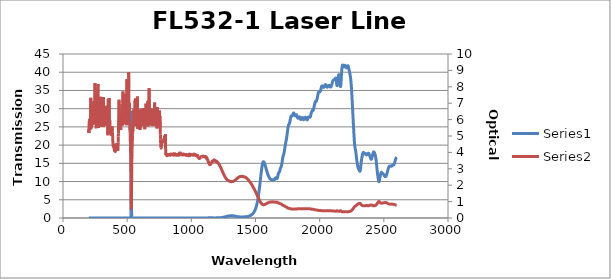
| Category | Series 0 |
|---|---|
| 2600.0 | 16.703 |
| 2599.0 | 16.659 |
| 2598.0 | 16.609 |
| 2597.0 | 16.558 |
| 2596.0 | 16.503 |
| 2595.0 | 16.426 |
| 2594.0 | 16.337 |
| 2593.0 | 16.239 |
| 2592.0 | 16.135 |
| 2591.0 | 16.023 |
| 2590.0 | 15.91 |
| 2589.0 | 15.807 |
| 2588.0 | 15.684 |
| 2587.0 | 15.555 |
| 2586.0 | 15.434 |
| 2585.0 | 15.313 |
| 2584.0 | 15.189 |
| 2583.0 | 15.06 |
| 2582.0 | 14.946 |
| 2581.0 | 14.845 |
| 2580.0 | 14.757 |
| 2579.0 | 14.694 |
| 2578.0 | 14.64 |
| 2577.0 | 14.598 |
| 2576.0 | 14.578 |
| 2575.0 | 14.567 |
| 2574.0 | 14.557 |
| 2573.0 | 14.546 |
| 2572.0 | 14.538 |
| 2571.0 | 14.523 |
| 2570.0 | 14.503 |
| 2569.0 | 14.484 |
| 2568.0 | 14.46 |
| 2567.0 | 14.419 |
| 2566.0 | 14.386 |
| 2565.0 | 14.357 |
| 2564.0 | 14.309 |
| 2563.0 | 14.27 |
| 2562.0 | 14.249 |
| 2561.0 | 14.229 |
| 2560.0 | 14.21 |
| 2559.0 | 14.217 |
| 2558.0 | 14.215 |
| 2557.0 | 14.216 |
| 2556.0 | 14.228 |
| 2555.0 | 14.237 |
| 2554.0 | 14.256 |
| 2553.0 | 14.273 |
| 2552.0 | 14.277 |
| 2551.0 | 14.286 |
| 2550.0 | 14.296 |
| 2549.0 | 14.29 |
| 2548.0 | 14.293 |
| 2547.0 | 14.28 |
| 2546.0 | 14.248 |
| 2545.0 | 14.234 |
| 2544.0 | 14.212 |
| 2543.0 | 14.166 |
| 2542.0 | 14.129 |
| 2541.0 | 14.08 |
| 2540.0 | 14.016 |
| 2539.0 | 13.948 |
| 2538.0 | 13.865 |
| 2537.0 | 13.785 |
| 2536.0 | 13.694 |
| 2535.0 | 13.585 |
| 2534.0 | 13.471 |
| 2533.0 | 13.359 |
| 2532.0 | 13.236 |
| 2531.0 | 13.104 |
| 2530.0 | 12.983 |
| 2529.0 | 12.852 |
| 2528.0 | 12.706 |
| 2527.0 | 12.574 |
| 2526.0 | 12.448 |
| 2525.0 | 12.31 |
| 2524.0 | 12.171 |
| 2523.0 | 12.061 |
| 2522.0 | 11.941 |
| 2521.0 | 11.819 |
| 2520.0 | 11.728 |
| 2519.0 | 11.645 |
| 2518.0 | 11.556 |
| 2517.0 | 11.487 |
| 2516.0 | 11.439 |
| 2515.0 | 11.384 |
| 2514.0 | 11.347 |
| 2513.0 | 11.341 |
| 2512.0 | 11.335 |
| 2511.0 | 11.33 |
| 2510.0 | 11.352 |
| 2509.0 | 11.381 |
| 2508.0 | 11.4 |
| 2507.0 | 11.439 |
| 2506.0 | 11.497 |
| 2505.0 | 11.538 |
| 2504.0 | 11.586 |
| 2503.0 | 11.655 |
| 2502.0 | 11.72 |
| 2501.0 | 11.771 |
| 2500.0 | 11.835 |
| 2499.0 | 11.902 |
| 2498.0 | 11.946 |
| 2497.0 | 11.999 |
| 2496.0 | 12.067 |
| 2495.0 | 12.101 |
| 2494.0 | 12.133 |
| 2493.0 | 12.181 |
| 2492.0 | 12.208 |
| 2491.0 | 12.221 |
| 2490.0 | 12.261 |
| 2489.0 | 12.297 |
| 2488.0 | 12.318 |
| 2487.0 | 12.365 |
| 2486.0 | 12.417 |
| 2485.0 | 12.449 |
| 2484.0 | 12.485 |
| 2483.0 | 12.527 |
| 2482.0 | 12.542 |
| 2481.0 | 12.528 |
| 2480.0 | 12.512 |
| 2479.0 | 12.475 |
| 2478.0 | 12.383 |
| 2477.0 | 12.294 |
| 2476.0 | 12.189 |
| 2475.0 | 12.036 |
| 2474.0 | 11.893 |
| 2473.0 | 11.746 |
| 2472.0 | 11.549 |
| 2471.0 | 11.362 |
| 2470.0 | 11.172 |
| 2469.0 | 10.953 |
| 2468.0 | 10.75 |
| 2467.0 | 10.559 |
| 2466.0 | 10.369 |
| 2465.0 | 10.203 |
| 2464.0 | 10.073 |
| 2463.0 | 9.997 |
| 2462.0 | 9.96 |
| 2461.0 | 9.979 |
| 2460.0 | 10.082 |
| 2459.0 | 10.206 |
| 2458.0 | 10.375 |
| 2457.0 | 10.613 |
| 2456.0 | 10.835 |
| 2455.0 | 11.078 |
| 2454.0 | 11.351 |
| 2453.0 | 11.6 |
| 2452.0 | 11.865 |
| 2451.0 | 12.159 |
| 2450.0 | 12.442 |
| 2449.0 | 12.749 |
| 2448.0 | 13.061 |
| 2447.0 | 13.39 |
| 2446.0 | 13.746 |
| 2445.0 | 14.077 |
| 2444.0 | 14.465 |
| 2443.0 | 14.827 |
| 2442.0 | 15.133 |
| 2441.0 | 15.502 |
| 2440.0 | 15.786 |
| 2439.0 | 16.044 |
| 2438.0 | 16.34 |
| 2437.0 | 16.54 |
| 2436.0 | 16.74 |
| 2435.0 | 16.947 |
| 2434.0 | 17.074 |
| 2433.0 | 17.241 |
| 2432.0 | 17.379 |
| 2431.0 | 17.482 |
| 2430.0 | 17.627 |
| 2429.0 | 17.707 |
| 2428.0 | 17.815 |
| 2427.0 | 17.914 |
| 2426.0 | 17.959 |
| 2425.0 | 18.056 |
| 2424.0 | 18.088 |
| 2423.0 | 18.099 |
| 2422.0 | 18.152 |
| 2421.0 | 18.102 |
| 2420.0 | 18.081 |
| 2419.0 | 18.069 |
| 2418.0 | 17.953 |
| 2417.0 | 17.914 |
| 2416.0 | 17.822 |
| 2415.0 | 17.68 |
| 2414.0 | 17.601 |
| 2413.0 | 17.445 |
| 2412.0 | 17.3 |
| 2411.0 | 17.164 |
| 2410.0 | 16.974 |
| 2409.0 | 16.851 |
| 2408.0 | 16.679 |
| 2407.0 | 16.525 |
| 2406.0 | 16.422 |
| 2405.0 | 16.266 |
| 2404.0 | 16.21 |
| 2403.0 | 16.151 |
| 2402.0 | 16.094 |
| 2401.0 | 16.142 |
| 2400.0 | 16.141 |
| 2399.0 | 16.196 |
| 2398.0 | 16.298 |
| 2397.0 | 16.345 |
| 2396.0 | 16.469 |
| 2395.0 | 16.569 |
| 2394.0 | 16.653 |
| 2393.0 | 16.786 |
| 2392.0 | 16.864 |
| 2391.0 | 16.989 |
| 2390.0 | 17.084 |
| 2389.0 | 17.165 |
| 2388.0 | 17.291 |
| 2387.0 | 17.353 |
| 2386.0 | 17.458 |
| 2385.0 | 17.545 |
| 2384.0 | 17.582 |
| 2383.0 | 17.681 |
| 2382.0 | 17.706 |
| 2381.0 | 17.732 |
| 2380.0 | 17.784 |
| 2379.0 | 17.754 |
| 2378.0 | 17.769 |
| 2377.0 | 17.743 |
| 2376.0 | 17.701 |
| 2375.0 | 17.682 |
| 2374.0 | 17.62 |
| 2373.0 | 17.596 |
| 2372.0 | 17.544 |
| 2371.0 | 17.494 |
| 2370.0 | 17.479 |
| 2369.0 | 17.412 |
| 2368.0 | 17.391 |
| 2367.0 | 17.356 |
| 2366.0 | 17.311 |
| 2365.0 | 17.326 |
| 2364.0 | 17.31 |
| 2363.0 | 17.346 |
| 2362.0 | 17.408 |
| 2361.0 | 17.439 |
| 2360.0 | 17.532 |
| 2359.0 | 17.576 |
| 2358.0 | 17.63 |
| 2357.0 | 17.668 |
| 2356.0 | 17.671 |
| 2355.0 | 17.688 |
| 2354.0 | 17.651 |
| 2353.0 | 17.643 |
| 2352.0 | 17.633 |
| 2351.0 | 17.61 |
| 2350.0 | 17.651 |
| 2349.0 | 17.655 |
| 2348.0 | 17.703 |
| 2347.0 | 17.766 |
| 2346.0 | 17.794 |
| 2345.0 | 17.875 |
| 2344.0 | 17.904 |
| 2343.0 | 17.945 |
| 2342.0 | 17.979 |
| 2341.0 | 17.979 |
| 2340.0 | 17.991 |
| 2339.0 | 17.942 |
| 2338.0 | 17.909 |
| 2337.0 | 17.839 |
| 2336.0 | 17.722 |
| 2335.0 | 17.635 |
| 2334.0 | 17.458 |
| 2333.0 | 17.319 |
| 2332.0 | 17.15 |
| 2331.0 | 16.946 |
| 2330.0 | 16.786 |
| 2329.0 | 16.564 |
| 2328.0 | 16.376 |
| 2327.0 | 16.146 |
| 2326.0 | 15.916 |
| 2325.0 | 15.678 |
| 2324.0 | 15.38 |
| 2323.0 | 15.096 |
| 2322.0 | 14.749 |
| 2321.0 | 14.395 |
| 2320.0 | 14.06 |
| 2319.0 | 13.705 |
| 2318.0 | 13.434 |
| 2317.0 | 13.179 |
| 2316.0 | 12.997 |
| 2315.0 | 12.895 |
| 2314.0 | 12.824 |
| 2313.0 | 12.841 |
| 2312.0 | 12.866 |
| 2311.0 | 12.94 |
| 2310.0 | 13.021 |
| 2309.0 | 13.103 |
| 2308.0 | 13.2 |
| 2307.0 | 13.252 |
| 2306.0 | 13.326 |
| 2305.0 | 13.367 |
| 2304.0 | 13.409 |
| 2303.0 | 13.47 |
| 2302.0 | 13.524 |
| 2301.0 | 13.61 |
| 2300.0 | 13.709 |
| 2299.0 | 13.834 |
| 2298.0 | 13.982 |
| 2297.0 | 14.149 |
| 2296.0 | 14.336 |
| 2295.0 | 14.542 |
| 2294.0 | 14.759 |
| 2293.0 | 14.97 |
| 2292.0 | 15.207 |
| 2291.0 | 15.451 |
| 2290.0 | 15.697 |
| 2289.0 | 15.969 |
| 2288.0 | 16.243 |
| 2287.0 | 16.522 |
| 2286.0 | 16.809 |
| 2285.0 | 17.103 |
| 2284.0 | 17.391 |
| 2283.0 | 17.684 |
| 2282.0 | 17.971 |
| 2281.0 | 18.213 |
| 2280.0 | 18.452 |
| 2279.0 | 18.664 |
| 2278.0 | 18.857 |
| 2277.0 | 19.052 |
| 2276.0 | 19.245 |
| 2275.0 | 19.478 |
| 2274.0 | 19.71 |
| 2273.0 | 20.017 |
| 2272.0 | 20.368 |
| 2271.0 | 20.783 |
| 2270.0 | 21.283 |
| 2269.0 | 21.816 |
| 2268.0 | 22.4 |
| 2267.0 | 23.004 |
| 2266.0 | 23.636 |
| 2265.0 | 24.272 |
| 2264.0 | 24.935 |
| 2263.0 | 25.626 |
| 2262.0 | 26.289 |
| 2261.0 | 26.964 |
| 2260.0 | 27.614 |
| 2259.0 | 28.306 |
| 2258.0 | 28.966 |
| 2257.0 | 29.659 |
| 2256.0 | 30.353 |
| 2255.0 | 31.009 |
| 2254.0 | 31.699 |
| 2253.0 | 32.351 |
| 2252.0 | 33.007 |
| 2251.0 | 33.647 |
| 2250.0 | 34.283 |
| 2249.0 | 34.872 |
| 2248.0 | 35.417 |
| 2247.0 | 35.954 |
| 2246.0 | 36.438 |
| 2245.0 | 36.894 |
| 2244.0 | 37.326 |
| 2243.0 | 37.706 |
| 2242.0 | 38.052 |
| 2241.0 | 38.361 |
| 2240.0 | 38.641 |
| 2239.0 | 38.882 |
| 2238.0 | 39.111 |
| 2237.0 | 39.31 |
| 2236.0 | 39.484 |
| 2235.0 | 39.649 |
| 2234.0 | 39.81 |
| 2233.0 | 39.966 |
| 2232.0 | 40.129 |
| 2231.0 | 40.308 |
| 2230.0 | 40.485 |
| 2229.0 | 40.665 |
| 2228.0 | 40.86 |
| 2227.0 | 41.038 |
| 2226.0 | 41.213 |
| 2225.0 | 41.377 |
| 2224.0 | 41.509 |
| 2223.0 | 41.624 |
| 2222.0 | 41.708 |
| 2221.0 | 41.754 |
| 2220.0 | 41.78 |
| 2219.0 | 41.765 |
| 2218.0 | 41.725 |
| 2217.0 | 41.669 |
| 2216.0 | 41.584 |
| 2215.0 | 41.504 |
| 2214.0 | 41.414 |
| 2213.0 | 41.327 |
| 2212.0 | 41.266 |
| 2211.0 | 41.208 |
| 2210.0 | 41.182 |
| 2209.0 | 41.189 |
| 2208.0 | 41.203 |
| 2207.0 | 41.251 |
| 2206.0 | 41.313 |
| 2205.0 | 41.393 |
| 2204.0 | 41.484 |
| 2203.0 | 41.573 |
| 2202.0 | 41.67 |
| 2201.0 | 41.752 |
| 2200.0 | 41.827 |
| 2199.0 | 41.883 |
| 2198.0 | 41.909 |
| 2197.0 | 41.911 |
| 2196.0 | 41.894 |
| 2195.0 | 41.847 |
| 2194.0 | 41.79 |
| 2193.0 | 41.706 |
| 2192.0 | 41.626 |
| 2191.0 | 41.564 |
| 2190.0 | 41.492 |
| 2189.0 | 41.473 |
| 2188.0 | 41.466 |
| 2187.0 | 41.493 |
| 2186.0 | 41.565 |
| 2185.0 | 41.638 |
| 2184.0 | 41.731 |
| 2183.0 | 41.822 |
| 2182.0 | 41.89 |
| 2181.0 | 41.958 |
| 2180.0 | 41.981 |
| 2179.0 | 41.985 |
| 2178.0 | 41.948 |
| 2177.0 | 41.855 |
| 2176.0 | 41.72 |
| 2175.0 | 41.521 |
| 2174.0 | 41.249 |
| 2173.0 | 40.905 |
| 2172.0 | 40.471 |
| 2171.0 | 39.975 |
| 2170.0 | 39.403 |
| 2169.0 | 38.767 |
| 2168.0 | 38.153 |
| 2167.0 | 37.52 |
| 2166.0 | 36.971 |
| 2165.0 | 36.553 |
| 2164.0 | 36.239 |
| 2163.0 | 36.096 |
| 2162.0 | 36.079 |
| 2161.0 | 36.211 |
| 2160.0 | 36.451 |
| 2159.0 | 36.764 |
| 2158.0 | 37.128 |
| 2157.0 | 37.512 |
| 2156.0 | 37.902 |
| 2155.0 | 38.262 |
| 2154.0 | 38.595 |
| 2153.0 | 38.875 |
| 2152.0 | 39.078 |
| 2151.0 | 39.233 |
| 2150.0 | 39.314 |
| 2149.0 | 39.332 |
| 2148.0 | 39.293 |
| 2147.0 | 39.179 |
| 2146.0 | 39.025 |
| 2145.0 | 38.804 |
| 2144.0 | 38.545 |
| 2143.0 | 38.246 |
| 2142.0 | 37.915 |
| 2141.0 | 37.567 |
| 2140.0 | 37.215 |
| 2139.0 | 36.909 |
| 2138.0 | 36.644 |
| 2137.0 | 36.435 |
| 2136.0 | 36.336 |
| 2135.0 | 36.33 |
| 2134.0 | 36.438 |
| 2133.0 | 36.639 |
| 2132.0 | 36.887 |
| 2131.0 | 37.209 |
| 2130.0 | 37.508 |
| 2129.0 | 37.802 |
| 2128.0 | 38.044 |
| 2127.0 | 38.218 |
| 2126.0 | 38.336 |
| 2125.0 | 38.372 |
| 2124.0 | 38.386 |
| 2123.0 | 38.348 |
| 2122.0 | 38.289 |
| 2121.0 | 38.229 |
| 2120.0 | 38.159 |
| 2119.0 | 38.12 |
| 2118.0 | 38.071 |
| 2117.0 | 38.041 |
| 2116.0 | 38.012 |
| 2115.0 | 37.983 |
| 2114.0 | 37.974 |
| 2113.0 | 37.944 |
| 2112.0 | 37.934 |
| 2111.0 | 37.911 |
| 2110.0 | 37.896 |
| 2109.0 | 37.881 |
| 2108.0 | 37.852 |
| 2107.0 | 37.847 |
| 2106.0 | 37.8 |
| 2105.0 | 37.773 |
| 2104.0 | 37.714 |
| 2103.0 | 37.643 |
| 2102.0 | 37.566 |
| 2101.0 | 37.457 |
| 2100.0 | 37.355 |
| 2099.0 | 37.22 |
| 2098.0 | 37.09 |
| 2097.0 | 36.96 |
| 2096.0 | 36.807 |
| 2095.0 | 36.677 |
| 2094.0 | 36.537 |
| 2093.0 | 36.424 |
| 2092.0 | 36.306 |
| 2091.0 | 36.21 |
| 2090.0 | 36.123 |
| 2089.0 | 36.04 |
| 2088.0 | 35.996 |
| 2087.0 | 35.941 |
| 2086.0 | 35.927 |
| 2085.0 | 35.912 |
| 2084.0 | 35.923 |
| 2083.0 | 35.946 |
| 2082.0 | 35.98 |
| 2081.0 | 36.041 |
| 2080.0 | 36.089 |
| 2079.0 | 36.166 |
| 2078.0 | 36.22 |
| 2077.0 | 36.286 |
| 2076.0 | 36.332 |
| 2075.0 | 36.363 |
| 2074.0 | 36.393 |
| 2073.0 | 36.382 |
| 2072.0 | 36.386 |
| 2071.0 | 36.354 |
| 2070.0 | 36.328 |
| 2069.0 | 36.285 |
| 2068.0 | 36.244 |
| 2067.0 | 36.197 |
| 2066.0 | 36.14 |
| 2065.0 | 36.103 |
| 2064.0 | 36.036 |
| 2063.0 | 36.004 |
| 2062.0 | 35.949 |
| 2061.0 | 35.922 |
| 2060.0 | 35.899 |
| 2059.0 | 35.882 |
| 2058.0 | 35.904 |
| 2057.0 | 35.919 |
| 2056.0 | 35.979 |
| 2055.0 | 36.026 |
| 2054.0 | 36.116 |
| 2053.0 | 36.194 |
| 2052.0 | 36.284 |
| 2051.0 | 36.371 |
| 2050.0 | 36.439 |
| 2049.0 | 36.515 |
| 2048.0 | 36.544 |
| 2047.0 | 36.586 |
| 2046.0 | 36.59 |
| 2045.0 | 36.603 |
| 2044.0 | 36.584 |
| 2043.0 | 36.567 |
| 2042.0 | 36.538 |
| 2041.0 | 36.487 |
| 2040.0 | 36.442 |
| 2039.0 | 36.36 |
| 2038.0 | 36.296 |
| 2037.0 | 36.192 |
| 2036.0 | 36.116 |
| 2035.0 | 36.016 |
| 2034.0 | 35.945 |
| 2033.0 | 35.888 |
| 2032.0 | 35.844 |
| 2031.0 | 35.835 |
| 2030.0 | 35.833 |
| 2029.0 | 35.877 |
| 2028.0 | 35.907 |
| 2027.0 | 35.973 |
| 2026.0 | 36.014 |
| 2025.0 | 36.077 |
| 2024.0 | 36.112 |
| 2023.0 | 36.153 |
| 2022.0 | 36.183 |
| 2021.0 | 36.203 |
| 2020.0 | 36.227 |
| 2019.0 | 36.225 |
| 2018.0 | 36.236 |
| 2017.0 | 36.202 |
| 2016.0 | 36.176 |
| 2015.0 | 36.096 |
| 2014.0 | 36.014 |
| 2013.0 | 35.872 |
| 2012.0 | 35.733 |
| 2011.0 | 35.568 |
| 2010.0 | 35.398 |
| 2009.0 | 35.243 |
| 2008.0 | 35.088 |
| 2007.0 | 34.973 |
| 2006.0 | 34.865 |
| 2005.0 | 34.799 |
| 2004.0 | 34.732 |
| 2003.0 | 34.7 |
| 2002.0 | 34.649 |
| 2001.0 | 34.628 |
| 2000.0 | 34.58 |
| 1999.0 | 34.572 |
| 1998.0 | 34.54 |
| 1997.0 | 34.538 |
| 1996.0 | 34.529 |
| 1995.0 | 34.539 |
| 1994.0 | 34.555 |
| 1993.0 | 34.557 |
| 1992.0 | 34.552 |
| 1991.0 | 34.504 |
| 1990.0 | 34.444 |
| 1989.0 | 34.319 |
| 1988.0 | 34.184 |
| 1987.0 | 33.993 |
| 1986.0 | 33.804 |
| 1985.0 | 33.596 |
| 1984.0 | 33.412 |
| 1983.0 | 33.22 |
| 1982.0 | 33.067 |
| 1981.0 | 32.907 |
| 1980.0 | 32.773 |
| 1979.0 | 32.626 |
| 1978.0 | 32.498 |
| 1977.0 | 32.369 |
| 1976.0 | 32.252 |
| 1975.0 | 32.139 |
| 1974.0 | 32.054 |
| 1973.0 | 31.992 |
| 1972.0 | 31.958 |
| 1971.0 | 31.959 |
| 1970.0 | 31.964 |
| 1969.0 | 31.987 |
| 1968.0 | 31.981 |
| 1967.0 | 31.967 |
| 1966.0 | 31.906 |
| 1965.0 | 31.831 |
| 1964.0 | 31.705 |
| 1963.0 | 31.569 |
| 1962.0 | 31.41 |
| 1961.0 | 31.247 |
| 1960.0 | 31.082 |
| 1959.0 | 30.945 |
| 1958.0 | 30.783 |
| 1957.0 | 30.644 |
| 1956.0 | 30.478 |
| 1955.0 | 30.32 |
| 1954.0 | 30.136 |
| 1953.0 | 29.974 |
| 1952.0 | 29.807 |
| 1951.0 | 29.675 |
| 1950.0 | 29.567 |
| 1949.0 | 29.507 |
| 1948.0 | 29.476 |
| 1947.0 | 29.481 |
| 1946.0 | 29.491 |
| 1945.0 | 29.514 |
| 1944.0 | 29.511 |
| 1943.0 | 29.501 |
| 1942.0 | 29.45 |
| 1941.0 | 29.401 |
| 1940.0 | 29.329 |
| 1939.0 | 29.25 |
| 1938.0 | 29.157 |
| 1937.0 | 29.065 |
| 1936.0 | 28.98 |
| 1935.0 | 28.896 |
| 1934.0 | 28.794 |
| 1933.0 | 28.674 |
| 1932.0 | 28.504 |
| 1931.0 | 28.332 |
| 1930.0 | 28.146 |
| 1929.0 | 27.981 |
| 1928.0 | 27.835 |
| 1927.0 | 27.736 |
| 1926.0 | 27.684 |
| 1925.0 | 27.666 |
| 1924.0 | 27.682 |
| 1923.0 | 27.721 |
| 1922.0 | 27.749 |
| 1921.0 | 27.761 |
| 1920.0 | 27.749 |
| 1919.0 | 27.717 |
| 1918.0 | 27.7 |
| 1917.0 | 27.695 |
| 1916.0 | 27.715 |
| 1915.0 | 27.734 |
| 1914.0 | 27.75 |
| 1913.0 | 27.739 |
| 1912.0 | 27.713 |
| 1911.0 | 27.662 |
| 1910.0 | 27.599 |
| 1909.0 | 27.5 |
| 1908.0 | 27.376 |
| 1907.0 | 27.244 |
| 1906.0 | 27.116 |
| 1905.0 | 27.021 |
| 1904.0 | 26.938 |
| 1903.0 | 26.911 |
| 1902.0 | 26.913 |
| 1901.0 | 26.953 |
| 1900.0 | 26.994 |
| 1899.0 | 27.034 |
| 1898.0 | 27.058 |
| 1897.0 | 27.091 |
| 1896.0 | 27.13 |
| 1895.0 | 27.19 |
| 1894.0 | 27.271 |
| 1893.0 | 27.38 |
| 1892.0 | 27.468 |
| 1891.0 | 27.559 |
| 1890.0 | 27.616 |
| 1889.0 | 27.662 |
| 1888.0 | 27.674 |
| 1887.0 | 27.631 |
| 1886.0 | 27.56 |
| 1885.0 | 27.478 |
| 1884.0 | 27.392 |
| 1883.0 | 27.317 |
| 1882.0 | 27.261 |
| 1881.0 | 27.216 |
| 1880.0 | 27.19 |
| 1879.0 | 27.139 |
| 1878.0 | 27.088 |
| 1877.0 | 27.021 |
| 1876.0 | 26.978 |
| 1875.0 | 26.988 |
| 1874.0 | 27.053 |
| 1873.0 | 27.137 |
| 1872.0 | 27.211 |
| 1871.0 | 27.278 |
| 1870.0 | 27.346 |
| 1869.0 | 27.429 |
| 1868.0 | 27.517 |
| 1867.0 | 27.576 |
| 1866.0 | 27.602 |
| 1865.0 | 27.59 |
| 1864.0 | 27.558 |
| 1863.0 | 27.511 |
| 1862.0 | 27.478 |
| 1861.0 | 27.444 |
| 1860.0 | 27.391 |
| 1859.0 | 27.33 |
| 1858.0 | 27.259 |
| 1857.0 | 27.178 |
| 1856.0 | 27.109 |
| 1855.0 | 27.062 |
| 1854.0 | 27.04 |
| 1853.0 | 27.04 |
| 1852.0 | 27.049 |
| 1851.0 | 27.09 |
| 1850.0 | 27.179 |
| 1849.0 | 27.293 |
| 1848.0 | 27.429 |
| 1847.0 | 27.517 |
| 1846.0 | 27.589 |
| 1845.0 | 27.624 |
| 1844.0 | 27.658 |
| 1843.0 | 27.694 |
| 1842.0 | 27.74 |
| 1841.0 | 27.762 |
| 1840.0 | 27.767 |
| 1839.0 | 27.746 |
| 1838.0 | 27.697 |
| 1837.0 | 27.636 |
| 1836.0 | 27.531 |
| 1835.0 | 27.444 |
| 1834.0 | 27.383 |
| 1833.0 | 27.368 |
| 1832.0 | 27.358 |
| 1831.0 | 27.368 |
| 1830.0 | 27.395 |
| 1829.0 | 27.445 |
| 1828.0 | 27.535 |
| 1827.0 | 27.644 |
| 1826.0 | 27.747 |
| 1825.0 | 27.821 |
| 1824.0 | 27.9 |
| 1823.0 | 27.97 |
| 1822.0 | 28.072 |
| 1821.0 | 28.188 |
| 1820.0 | 28.289 |
| 1819.0 | 28.346 |
| 1818.0 | 28.363 |
| 1817.0 | 28.35 |
| 1816.0 | 28.318 |
| 1815.0 | 28.257 |
| 1814.0 | 28.175 |
| 1813.0 | 28.111 |
| 1812.0 | 28.057 |
| 1811.0 | 28.013 |
| 1810.0 | 28.01 |
| 1809.0 | 28.04 |
| 1808.0 | 28.062 |
| 1807.0 | 28.105 |
| 1806.0 | 28.162 |
| 1805.0 | 28.199 |
| 1804.0 | 28.277 |
| 1803.0 | 28.364 |
| 1802.0 | 28.45 |
| 1801.0 | 28.563 |
| 1800.0 | 28.668 |
| 1799.0 | 28.747 |
| 1798.0 | 28.796 |
| 1797.0 | 28.829 |
| 1796.0 | 28.799 |
| 1795.0 | 28.735 |
| 1794.0 | 28.667 |
| 1793.0 | 28.561 |
| 1792.0 | 28.471 |
| 1791.0 | 28.388 |
| 1790.0 | 28.304 |
| 1789.0 | 28.228 |
| 1788.0 | 28.161 |
| 1787.0 | 28.104 |
| 1786.0 | 28.038 |
| 1785.0 | 28.014 |
| 1784.0 | 27.989 |
| 1783.0 | 27.969 |
| 1782.0 | 27.991 |
| 1781.0 | 27.991 |
| 1780.0 | 28.002 |
| 1779.0 | 27.99 |
| 1778.0 | 27.969 |
| 1777.0 | 27.9 |
| 1776.0 | 27.803 |
| 1775.0 | 27.694 |
| 1774.0 | 27.519 |
| 1773.0 | 27.352 |
| 1772.0 | 27.169 |
| 1771.0 | 26.965 |
| 1770.0 | 26.783 |
| 1769.0 | 26.602 |
| 1768.0 | 26.439 |
| 1767.0 | 26.28 |
| 1766.0 | 26.151 |
| 1765.0 | 26.047 |
| 1764.0 | 25.922 |
| 1763.0 | 25.843 |
| 1762.0 | 25.776 |
| 1761.0 | 25.71 |
| 1760.0 | 25.657 |
| 1759.0 | 25.608 |
| 1758.0 | 25.563 |
| 1757.0 | 25.453 |
| 1756.0 | 25.321 |
| 1755.0 | 25.182 |
| 1754.0 | 24.966 |
| 1753.0 | 24.739 |
| 1752.0 | 24.5 |
| 1751.0 | 24.252 |
| 1750.0 | 23.967 |
| 1749.0 | 23.687 |
| 1748.0 | 23.435 |
| 1747.0 | 23.152 |
| 1746.0 | 22.843 |
| 1745.0 | 22.572 |
| 1744.0 | 22.307 |
| 1743.0 | 22.024 |
| 1742.0 | 21.795 |
| 1741.0 | 21.62 |
| 1740.0 | 21.455 |
| 1739.0 | 21.263 |
| 1738.0 | 21.103 |
| 1737.0 | 20.95 |
| 1736.0 | 20.742 |
| 1735.0 | 20.528 |
| 1734.0 | 20.346 |
| 1733.0 | 20.166 |
| 1732.0 | 19.964 |
| 1731.0 | 19.754 |
| 1730.0 | 19.557 |
| 1729.0 | 19.349 |
| 1728.0 | 19.072 |
| 1727.0 | 18.815 |
| 1726.0 | 18.588 |
| 1725.0 | 18.349 |
| 1724.0 | 18.122 |
| 1723.0 | 17.941 |
| 1722.0 | 17.825 |
| 1721.0 | 17.693 |
| 1720.0 | 17.54 |
| 1719.0 | 17.425 |
| 1718.0 | 17.326 |
| 1717.0 | 17.179 |
| 1716.0 | 17.035 |
| 1715.0 | 16.928 |
| 1714.0 | 16.817 |
| 1713.0 | 16.662 |
| 1712.0 | 16.458 |
| 1711.0 | 16.256 |
| 1710.0 | 16.052 |
| 1709.0 | 15.789 |
| 1708.0 | 15.517 |
| 1707.0 | 15.289 |
| 1706.0 | 15.102 |
| 1705.0 | 14.898 |
| 1704.0 | 14.692 |
| 1703.0 | 14.52 |
| 1702.0 | 14.379 |
| 1701.0 | 14.211 |
| 1700.0 | 14.045 |
| 1699.0 | 13.947 |
| 1698.0 | 13.893 |
| 1697.0 | 13.857 |
| 1696.0 | 13.797 |
| 1695.0 | 13.73 |
| 1694.0 | 13.665 |
| 1693.0 | 13.554 |
| 1692.0 | 13.368 |
| 1691.0 | 13.175 |
| 1690.0 | 13.03 |
| 1689.0 | 12.909 |
| 1688.0 | 12.794 |
| 1687.0 | 12.697 |
| 1686.0 | 12.641 |
| 1685.0 | 12.62 |
| 1684.0 | 12.573 |
| 1683.0 | 12.494 |
| 1682.0 | 12.439 |
| 1681.0 | 12.401 |
| 1680.0 | 12.357 |
| 1679.0 | 12.272 |
| 1678.0 | 12.149 |
| 1677.0 | 12.02 |
| 1676.0 | 11.886 |
| 1675.0 | 11.718 |
| 1674.0 | 11.512 |
| 1673.0 | 11.33 |
| 1672.0 | 11.187 |
| 1671.0 | 11.078 |
| 1670.0 | 10.97 |
| 1669.0 | 10.862 |
| 1668.0 | 10.806 |
| 1667.0 | 10.792 |
| 1666.0 | 10.792 |
| 1665.0 | 10.791 |
| 1664.0 | 10.814 |
| 1663.0 | 10.875 |
| 1662.0 | 10.957 |
| 1661.0 | 11.014 |
| 1660.0 | 11.036 |
| 1659.0 | 11.024 |
| 1658.0 | 11.025 |
| 1657.0 | 11.024 |
| 1656.0 | 11.002 |
| 1655.0 | 10.958 |
| 1654.0 | 10.907 |
| 1653.0 | 10.864 |
| 1652.0 | 10.832 |
| 1651.0 | 10.775 |
| 1650.0 | 10.681 |
| 1649.0 | 10.593 |
| 1648.0 | 10.546 |
| 1647.0 | 10.531 |
| 1646.0 | 10.535 |
| 1645.0 | 10.535 |
| 1644.0 | 10.523 |
| 1643.0 | 10.523 |
| 1642.0 | 10.541 |
| 1641.0 | 10.55 |
| 1640.0 | 10.544 |
| 1639.0 | 10.524 |
| 1638.0 | 10.504 |
| 1637.0 | 10.506 |
| 1636.0 | 10.508 |
| 1635.0 | 10.492 |
| 1634.0 | 10.444 |
| 1633.0 | 10.398 |
| 1632.0 | 10.368 |
| 1631.0 | 10.373 |
| 1630.0 | 10.39 |
| 1629.0 | 10.414 |
| 1628.0 | 10.414 |
| 1627.0 | 10.412 |
| 1626.0 | 10.423 |
| 1625.0 | 10.456 |
| 1624.0 | 10.489 |
| 1623.0 | 10.517 |
| 1622.0 | 10.534 |
| 1621.0 | 10.553 |
| 1620.0 | 10.574 |
| 1619.0 | 10.606 |
| 1618.0 | 10.636 |
| 1617.0 | 10.651 |
| 1616.0 | 10.649 |
| 1615.0 | 10.668 |
| 1614.0 | 10.701 |
| 1613.0 | 10.752 |
| 1612.0 | 10.821 |
| 1611.0 | 10.878 |
| 1610.0 | 10.915 |
| 1609.0 | 10.955 |
| 1608.0 | 11.014 |
| 1607.0 | 11.09 |
| 1606.0 | 11.183 |
| 1605.0 | 11.288 |
| 1604.0 | 11.369 |
| 1603.0 | 11.427 |
| 1602.0 | 11.484 |
| 1601.0 | 11.539 |
| 1600.0 | 11.613 |
| 1599.0 | 11.703 |
| 1598.0 | 11.802 |
| 1597.0 | 11.891 |
| 1596.0 | 11.974 |
| 1595.0 | 12.057 |
| 1594.0 | 12.136 |
| 1593.0 | 12.243 |
| 1592.0 | 12.371 |
| 1591.0 | 12.511 |
| 1590.0 | 12.651 |
| 1589.0 | 12.784 |
| 1588.0 | 12.897 |
| 1587.0 | 12.999 |
| 1586.0 | 13.113 |
| 1585.0 | 13.237 |
| 1584.0 | 13.365 |
| 1583.0 | 13.5 |
| 1582.0 | 13.631 |
| 1581.0 | 13.754 |
| 1580.0 | 13.864 |
| 1579.0 | 13.98 |
| 1578.0 | 14.096 |
| 1577.0 | 14.228 |
| 1576.0 | 14.372 |
| 1575.0 | 14.515 |
| 1574.0 | 14.657 |
| 1573.0 | 14.782 |
| 1572.0 | 14.89 |
| 1571.0 | 14.984 |
| 1570.0 | 15.072 |
| 1569.0 | 15.147 |
| 1568.0 | 15.217 |
| 1567.0 | 15.284 |
| 1566.0 | 15.336 |
| 1565.0 | 15.385 |
| 1564.0 | 15.414 |
| 1563.0 | 15.429 |
| 1562.0 | 15.427 |
| 1561.0 | 15.418 |
| 1560.0 | 15.387 |
| 1559.0 | 15.346 |
| 1558.0 | 15.279 |
| 1557.0 | 15.192 |
| 1556.0 | 15.083 |
| 1555.0 | 14.945 |
| 1554.0 | 14.782 |
| 1553.0 | 14.596 |
| 1552.0 | 14.396 |
| 1551.0 | 14.174 |
| 1550.0 | 13.937 |
| 1549.0 | 13.71 |
| 1548.0 | 13.462 |
| 1547.0 | 13.207 |
| 1546.0 | 12.945 |
| 1545.0 | 12.656 |
| 1544.0 | 12.362 |
| 1543.0 | 12.064 |
| 1542.0 | 11.759 |
| 1541.0 | 11.436 |
| 1540.0 | 11.112 |
| 1539.0 | 10.778 |
| 1538.0 | 10.435 |
| 1537.0 | 10.104 |
| 1536.0 | 9.779 |
| 1535.0 | 9.471 |
| 1534.0 | 9.163 |
| 1533.0 | 8.884 |
| 1532.0 | 8.583 |
| 1531.0 | 8.286 |
| 1530.0 | 8.011 |
| 1529.0 | 7.728 |
| 1528.0 | 7.455 |
| 1527.0 | 7.185 |
| 1526.0 | 6.915 |
| 1525.0 | 6.644 |
| 1524.0 | 6.378 |
| 1523.0 | 6.121 |
| 1522.0 | 5.871 |
| 1521.0 | 5.639 |
| 1520.0 | 5.428 |
| 1519.0 | 5.221 |
| 1518.0 | 5.019 |
| 1517.0 | 4.835 |
| 1516.0 | 4.649 |
| 1515.0 | 4.473 |
| 1514.0 | 4.311 |
| 1513.0 | 4.148 |
| 1512.0 | 3.991 |
| 1511.0 | 3.844 |
| 1510.0 | 3.681 |
| 1509.0 | 3.523 |
| 1508.0 | 3.374 |
| 1507.0 | 3.24 |
| 1506.0 | 3.113 |
| 1505.0 | 2.994 |
| 1504.0 | 2.883 |
| 1503.0 | 2.768 |
| 1502.0 | 2.664 |
| 1501.0 | 2.564 |
| 1500.0 | 2.477 |
| 1499.0 | 2.391 |
| 1498.0 | 2.311 |
| 1497.0 | 2.227 |
| 1496.0 | 2.141 |
| 1495.0 | 2.057 |
| 1494.0 | 1.975 |
| 1493.0 | 1.902 |
| 1492.0 | 1.836 |
| 1491.0 | 1.771 |
| 1490.0 | 1.709 |
| 1489.0 | 1.642 |
| 1488.0 | 1.587 |
| 1487.0 | 1.536 |
| 1486.0 | 1.49 |
| 1485.0 | 1.452 |
| 1484.0 | 1.408 |
| 1483.0 | 1.362 |
| 1482.0 | 1.316 |
| 1481.0 | 1.269 |
| 1480.0 | 1.224 |
| 1479.0 | 1.186 |
| 1478.0 | 1.148 |
| 1477.0 | 1.111 |
| 1476.0 | 1.073 |
| 1475.0 | 1.033 |
| 1474.0 | 1 |
| 1473.0 | 0.975 |
| 1472.0 | 0.955 |
| 1471.0 | 0.935 |
| 1470.0 | 0.903 |
| 1469.0 | 0.881 |
| 1468.0 | 0.853 |
| 1467.0 | 0.832 |
| 1466.0 | 0.809 |
| 1465.0 | 0.788 |
| 1464.0 | 0.762 |
| 1463.0 | 0.739 |
| 1462.0 | 0.715 |
| 1461.0 | 0.692 |
| 1460.0 | 0.679 |
| 1459.0 | 0.666 |
| 1458.0 | 0.652 |
| 1457.0 | 0.638 |
| 1456.0 | 0.623 |
| 1455.0 | 0.61 |
| 1454.0 | 0.595 |
| 1453.0 | 0.584 |
| 1452.0 | 0.571 |
| 1451.0 | 0.556 |
| 1450.0 | 0.538 |
| 1449.0 | 0.522 |
| 1448.0 | 0.507 |
| 1447.0 | 0.496 |
| 1446.0 | 0.487 |
| 1445.0 | 0.48 |
| 1444.0 | 0.47 |
| 1443.0 | 0.462 |
| 1442.0 | 0.453 |
| 1441.0 | 0.447 |
| 1440.0 | 0.44 |
| 1439.0 | 0.434 |
| 1438.0 | 0.422 |
| 1437.0 | 0.413 |
| 1436.0 | 0.402 |
| 1435.0 | 0.392 |
| 1434.0 | 0.387 |
| 1433.0 | 0.381 |
| 1432.0 | 0.375 |
| 1431.0 | 0.368 |
| 1430.0 | 0.364 |
| 1429.0 | 0.358 |
| 1428.0 | 0.358 |
| 1427.0 | 0.356 |
| 1426.0 | 0.352 |
| 1425.0 | 0.347 |
| 1424.0 | 0.34 |
| 1423.0 | 0.336 |
| 1422.0 | 0.331 |
| 1421.0 | 0.329 |
| 1420.0 | 0.326 |
| 1419.0 | 0.323 |
| 1418.0 | 0.319 |
| 1417.0 | 0.316 |
| 1416.0 | 0.315 |
| 1415.0 | 0.317 |
| 1414.0 | 0.318 |
| 1413.0 | 0.314 |
| 1412.0 | 0.313 |
| 1411.0 | 0.309 |
| 1410.0 | 0.308 |
| 1409.0 | 0.304 |
| 1408.0 | 0.298 |
| 1407.0 | 0.297 |
| 1406.0 | 0.294 |
| 1405.0 | 0.291 |
| 1404.0 | 0.292 |
| 1403.0 | 0.293 |
| 1402.0 | 0.297 |
| 1401.0 | 0.295 |
| 1400.0 | 0.293 |
| 1399.0 | 0.291 |
| 1398.0 | 0.287 |
| 1397.0 | 0.294 |
| 1396.0 | 0.291 |
| 1395.0 | 0.29 |
| 1394.0 | 0.282 |
| 1393.0 | 0.281 |
| 1392.0 | 0.283 |
| 1391.0 | 0.283 |
| 1390.0 | 0.286 |
| 1389.0 | 0.289 |
| 1388.0 | 0.292 |
| 1387.0 | 0.29 |
| 1386.0 | 0.293 |
| 1385.0 | 0.298 |
| 1384.0 | 0.296 |
| 1383.0 | 0.292 |
| 1382.0 | 0.29 |
| 1381.0 | 0.291 |
| 1380.0 | 0.296 |
| 1379.0 | 0.296 |
| 1378.0 | 0.301 |
| 1377.0 | 0.302 |
| 1376.0 | 0.306 |
| 1375.0 | 0.312 |
| 1374.0 | 0.316 |
| 1373.0 | 0.319 |
| 1372.0 | 0.32 |
| 1371.0 | 0.322 |
| 1370.0 | 0.322 |
| 1369.0 | 0.325 |
| 1368.0 | 0.332 |
| 1367.0 | 0.333 |
| 1366.0 | 0.336 |
| 1365.0 | 0.339 |
| 1364.0 | 0.346 |
| 1363.0 | 0.354 |
| 1362.0 | 0.361 |
| 1361.0 | 0.367 |
| 1360.0 | 0.369 |
| 1359.0 | 0.372 |
| 1358.0 | 0.379 |
| 1357.0 | 0.379 |
| 1356.0 | 0.388 |
| 1355.0 | 0.391 |
| 1354.0 | 0.395 |
| 1353.0 | 0.402 |
| 1352.0 | 0.415 |
| 1351.0 | 0.426 |
| 1350.0 | 0.433 |
| 1349.0 | 0.44 |
| 1348.0 | 0.445 |
| 1347.0 | 0.456 |
| 1346.0 | 0.457 |
| 1345.0 | 0.465 |
| 1344.0 | 0.466 |
| 1343.0 | 0.471 |
| 1342.0 | 0.478 |
| 1341.0 | 0.489 |
| 1340.0 | 0.502 |
| 1339.0 | 0.511 |
| 1338.0 | 0.521 |
| 1337.0 | 0.527 |
| 1336.0 | 0.537 |
| 1335.0 | 0.541 |
| 1334.0 | 0.547 |
| 1333.0 | 0.546 |
| 1332.0 | 0.55 |
| 1331.0 | 0.556 |
| 1330.0 | 0.565 |
| 1329.0 | 0.57 |
| 1328.0 | 0.577 |
| 1327.0 | 0.585 |
| 1326.0 | 0.595 |
| 1325.0 | 0.6 |
| 1324.0 | 0.601 |
| 1323.0 | 0.602 |
| 1322.0 | 0.601 |
| 1321.0 | 0.6 |
| 1320.0 | 0.602 |
| 1319.0 | 0.6 |
| 1318.0 | 0.602 |
| 1317.0 | 0.607 |
| 1316.0 | 0.612 |
| 1315.0 | 0.615 |
| 1314.0 | 0.617 |
| 1313.0 | 0.617 |
| 1312.0 | 0.613 |
| 1311.0 | 0.612 |
| 1310.0 | 0.609 |
| 1309.0 | 0.601 |
| 1308.0 | 0.596 |
| 1307.0 | 0.591 |
| 1306.0 | 0.594 |
| 1305.0 | 0.591 |
| 1304.0 | 0.596 |
| 1303.0 | 0.591 |
| 1302.0 | 0.588 |
| 1301.0 | 0.585 |
| 1300.0 | 0.583 |
| 1299.0 | 0.576 |
| 1298.0 | 0.568 |
| 1297.0 | 0.561 |
| 1296.0 | 0.553 |
| 1295.0 | 0.553 |
| 1294.0 | 0.552 |
| 1293.0 | 0.547 |
| 1292.0 | 0.542 |
| 1291.0 | 0.543 |
| 1290.0 | 0.536 |
| 1289.0 | 0.53 |
| 1288.0 | 0.523 |
| 1287.0 | 0.515 |
| 1286.0 | 0.504 |
| 1285.0 | 0.501 |
| 1284.0 | 0.493 |
| 1283.0 | 0.488 |
| 1282.0 | 0.484 |
| 1281.0 | 0.48 |
| 1280.0 | 0.477 |
| 1279.0 | 0.469 |
| 1278.0 | 0.459 |
| 1277.0 | 0.449 |
| 1276.0 | 0.437 |
| 1275.0 | 0.43 |
| 1274.0 | 0.42 |
| 1273.0 | 0.409 |
| 1272.0 | 0.404 |
| 1271.0 | 0.398 |
| 1270.0 | 0.389 |
| 1269.0 | 0.381 |
| 1268.0 | 0.37 |
| 1267.0 | 0.36 |
| 1266.0 | 0.347 |
| 1265.0 | 0.338 |
| 1264.0 | 0.33 |
| 1263.0 | 0.317 |
| 1262.0 | 0.307 |
| 1261.0 | 0.3 |
| 1260.0 | 0.29 |
| 1259.0 | 0.281 |
| 1258.0 | 0.27 |
| 1257.0 | 0.26 |
| 1256.0 | 0.251 |
| 1255.0 | 0.241 |
| 1254.0 | 0.233 |
| 1253.0 | 0.225 |
| 1252.0 | 0.213 |
| 1251.0 | 0.207 |
| 1250.0 | 0.198 |
| 1249.0 | 0.191 |
| 1248.0 | 0.185 |
| 1247.0 | 0.176 |
| 1246.0 | 0.167 |
| 1245.0 | 0.165 |
| 1244.0 | 0.15 |
| 1243.0 | 0.148 |
| 1242.0 | 0.142 |
| 1241.0 | 0.135 |
| 1240.0 | 0.131 |
| 1239.0 | 0.127 |
| 1238.0 | 0.119 |
| 1237.0 | 0.116 |
| 1236.0 | 0.112 |
| 1235.0 | 0.105 |
| 1234.0 | 0.102 |
| 1233.0 | 0.098 |
| 1232.0 | 0.095 |
| 1231.0 | 0.089 |
| 1230.0 | 0.087 |
| 1229.0 | 0.085 |
| 1228.0 | 0.08 |
| 1227.0 | 0.078 |
| 1226.0 | 0.075 |
| 1225.0 | 0.072 |
| 1224.0 | 0.07 |
| 1223.0 | 0.068 |
| 1222.0 | 0.064 |
| 1221.0 | 0.064 |
| 1220.0 | 0.061 |
| 1219.0 | 0.059 |
| 1218.0 | 0.056 |
| 1217.0 | 0.058 |
| 1216.0 | 0.052 |
| 1215.0 | 0.052 |
| 1214.0 | 0.051 |
| 1213.0 | 0.051 |
| 1212.0 | 0.046 |
| 1211.0 | 0.046 |
| 1210.0 | 0.045 |
| 1209.0 | 0.045 |
| 1208.0 | 0.043 |
| 1207.0 | 0.044 |
| 1206.0 | 0.043 |
| 1205.0 | 0.04 |
| 1204.0 | 0.041 |
| 1203.0 | 0.039 |
| 1202.0 | 0.039 |
| 1201.0 | 0.036 |
| 1200.0 | 0.037 |
| 1199.0 | 0.041 |
| 1198.0 | 0.039 |
| 1197.0 | 0.037 |
| 1196.0 | 0.036 |
| 1195.0 | 0.035 |
| 1194.0 | 0.035 |
| 1193.0 | 0.034 |
| 1192.0 | 0.036 |
| 1191.0 | 0.033 |
| 1190.0 | 0.032 |
| 1189.0 | 0.033 |
| 1188.0 | 0.033 |
| 1187.0 | 0.031 |
| 1186.0 | 0.033 |
| 1185.0 | 0.031 |
| 1184.0 | 0.033 |
| 1183.0 | 0.03 |
| 1182.0 | 0.03 |
| 1181.0 | 0.033 |
| 1180.0 | 0.03 |
| 1179.0 | 0.032 |
| 1178.0 | 0.031 |
| 1177.0 | 0.028 |
| 1176.0 | 0.032 |
| 1175.0 | 0.03 |
| 1174.0 | 0.034 |
| 1173.0 | 0.032 |
| 1172.0 | 0.035 |
| 1171.0 | 0.032 |
| 1170.0 | 0.034 |
| 1169.0 | 0.033 |
| 1168.0 | 0.032 |
| 1167.0 | 0.036 |
| 1166.0 | 0.033 |
| 1165.0 | 0.036 |
| 1164.0 | 0.036 |
| 1163.0 | 0.037 |
| 1162.0 | 0.036 |
| 1161.0 | 0.036 |
| 1160.0 | 0.038 |
| 1159.0 | 0.041 |
| 1158.0 | 0.04 |
| 1157.0 | 0.045 |
| 1156.0 | 0.043 |
| 1155.0 | 0.045 |
| 1154.0 | 0.046 |
| 1153.0 | 0.046 |
| 1152.0 | 0.048 |
| 1151.0 | 0.049 |
| 1150.0 | 0.05 |
| 1149.0 | 0.05 |
| 1148.0 | 0.055 |
| 1147.0 | 0.055 |
| 1146.0 | 0.053 |
| 1145.0 | 0.054 |
| 1144.0 | 0.057 |
| 1143.0 | 0.051 |
| 1142.0 | 0.055 |
| 1141.0 | 0.053 |
| 1140.0 | 0.049 |
| 1139.0 | 0.051 |
| 1138.0 | 0.049 |
| 1137.0 | 0.045 |
| 1136.0 | 0.043 |
| 1135.0 | 0.039 |
| 1134.0 | 0.04 |
| 1133.0 | 0.039 |
| 1132.0 | 0.038 |
| 1131.0 | 0.035 |
| 1130.0 | 0.032 |
| 1129.0 | 0.03 |
| 1128.0 | 0.029 |
| 1127.0 | 0.027 |
| 1126.0 | 0.028 |
| 1125.0 | 0.026 |
| 1124.0 | 0.025 |
| 1123.0 | 0.024 |
| 1122.0 | 0.022 |
| 1121.0 | 0.023 |
| 1120.0 | 0.022 |
| 1119.0 | 0.024 |
| 1118.0 | 0.022 |
| 1117.0 | 0.019 |
| 1116.0 | 0.021 |
| 1115.0 | 0.019 |
| 1114.0 | 0.021 |
| 1113.0 | 0.02 |
| 1112.0 | 0.019 |
| 1111.0 | 0.017 |
| 1110.0 | 0.019 |
| 1109.0 | 0.018 |
| 1108.0 | 0.018 |
| 1107.0 | 0.02 |
| 1106.0 | 0.017 |
| 1105.0 | 0.019 |
| 1104.0 | 0.015 |
| 1103.0 | 0.018 |
| 1102.0 | 0.018 |
| 1101.0 | 0.017 |
| 1100.0 | 0.016 |
| 1099.0 | 0.019 |
| 1098.0 | 0.017 |
| 1097.0 | 0.018 |
| 1096.0 | 0.018 |
| 1095.0 | 0.016 |
| 1094.0 | 0.015 |
| 1093.0 | 0.017 |
| 1092.0 | 0.018 |
| 1091.0 | 0.018 |
| 1090.0 | 0.016 |
| 1089.0 | 0.017 |
| 1088.0 | 0.016 |
| 1087.0 | 0.019 |
| 1086.0 | 0.017 |
| 1085.0 | 0.017 |
| 1084.0 | 0.019 |
| 1083.0 | 0.019 |
| 1082.0 | 0.018 |
| 1081.0 | 0.019 |
| 1080.0 | 0.018 |
| 1079.0 | 0.018 |
| 1078.0 | 0.019 |
| 1077.0 | 0.016 |
| 1076.0 | 0.02 |
| 1075.0 | 0.019 |
| 1074.0 | 0.019 |
| 1073.0 | 0.019 |
| 1072.0 | 0.019 |
| 1071.0 | 0.019 |
| 1070.0 | 0.02 |
| 1069.0 | 0.021 |
| 1068.0 | 0.02 |
| 1067.0 | 0.022 |
| 1066.0 | 0.021 |
| 1065.0 | 0.023 |
| 1064.0 | 0.023 |
| 1063.0 | 0.021 |
| 1062.0 | 0.024 |
| 1061.0 | 0.023 |
| 1060.0 | 0.023 |
| 1059.0 | 0.021 |
| 1058.0 | 0.023 |
| 1057.0 | 0.02 |
| 1056.0 | 0.02 |
| 1055.0 | 0.02 |
| 1054.0 | 0.02 |
| 1053.0 | 0.019 |
| 1052.0 | 0.018 |
| 1051.0 | 0.018 |
| 1050.0 | 0.019 |
| 1049.0 | 0.016 |
| 1048.0 | 0.015 |
| 1047.0 | 0.017 |
| 1046.0 | 0.015 |
| 1045.0 | 0.016 |
| 1044.0 | 0.018 |
| 1043.0 | 0.013 |
| 1042.0 | 0.014 |
| 1041.0 | 0.016 |
| 1040.0 | 0.015 |
| 1039.0 | 0.013 |
| 1038.0 | 0.014 |
| 1037.0 | 0.014 |
| 1036.0 | 0.014 |
| 1035.0 | 0.015 |
| 1034.0 | 0.014 |
| 1033.0 | 0.014 |
| 1032.0 | 0.014 |
| 1031.0 | 0.014 |
| 1030.0 | 0.015 |
| 1029.0 | 0.015 |
| 1028.0 | 0.015 |
| 1027.0 | 0.014 |
| 1026.0 | 0.015 |
| 1025.0 | 0.016 |
| 1024.0 | 0.013 |
| 1023.0 | 0.014 |
| 1022.0 | 0.013 |
| 1021.0 | 0.014 |
| 1020.0 | 0.013 |
| 1019.0 | 0.014 |
| 1018.0 | 0.014 |
| 1017.0 | 0.012 |
| 1016.0 | 0.013 |
| 1015.0 | 0.014 |
| 1014.0 | 0.014 |
| 1013.0 | 0.013 |
| 1012.0 | 0.014 |
| 1011.0 | 0.015 |
| 1010.0 | 0.014 |
| 1009.0 | 0.014 |
| 1008.0 | 0.014 |
| 1007.0 | 0.015 |
| 1006.0 | 0.012 |
| 1005.0 | 0.015 |
| 1004.0 | 0.013 |
| 1003.0 | 0.015 |
| 1002.0 | 0.012 |
| 1001.0 | 0.016 |
| 1000.0 | 0.012 |
| 999.0 | 0.014 |
| 998.0 | 0.014 |
| 997.0 | 0.013 |
| 996.0 | 0.012 |
| 995.0 | 0.016 |
| 994.0 | 0.015 |
| 993.0 | 0.013 |
| 992.0 | 0.014 |
| 991.0 | 0.013 |
| 990.0 | 0.014 |
| 989.0 | 0.015 |
| 988.0 | 0.014 |
| 987.0 | 0.012 |
| 986.0 | 0.018 |
| 985.0 | 0.013 |
| 984.0 | 0.013 |
| 983.0 | 0.013 |
| 982.0 | 0.015 |
| 981.0 | 0.012 |
| 980.0 | 0.015 |
| 979.0 | 0.016 |
| 978.0 | 0.014 |
| 977.0 | 0.012 |
| 976.0 | 0.015 |
| 975.0 | 0.015 |
| 974.0 | 0.015 |
| 973.0 | 0.015 |
| 972.0 | 0.016 |
| 971.0 | 0.016 |
| 970.0 | 0.015 |
| 969.0 | 0.012 |
| 968.0 | 0.014 |
| 967.0 | 0.014 |
| 966.0 | 0.014 |
| 965.0 | 0.014 |
| 964.0 | 0.012 |
| 963.0 | 0.014 |
| 962.0 | 0.013 |
| 961.0 | 0.014 |
| 960.0 | 0.015 |
| 959.0 | 0.015 |
| 958.0 | 0.013 |
| 957.0 | 0.012 |
| 956.0 | 0.014 |
| 955.0 | 0.013 |
| 954.0 | 0.012 |
| 953.0 | 0.015 |
| 952.0 | 0.015 |
| 951.0 | 0.012 |
| 950.0 | 0.011 |
| 949.0 | 0.014 |
| 948.0 | 0.013 |
| 947.0 | 0.014 |
| 946.0 | 0.011 |
| 945.0 | 0.013 |
| 944.0 | 0.016 |
| 943.0 | 0.013 |
| 942.0 | 0.014 |
| 941.0 | 0.013 |
| 940.0 | 0.013 |
| 939.0 | 0.014 |
| 938.0 | 0.012 |
| 937.0 | 0.015 |
| 936.0 | 0.014 |
| 935.0 | 0.013 |
| 934.0 | 0.014 |
| 933.0 | 0.012 |
| 932.0 | 0.015 |
| 931.0 | 0.014 |
| 930.0 | 0.014 |
| 929.0 | 0.013 |
| 928.0 | 0.012 |
| 927.0 | 0.014 |
| 926.0 | 0.012 |
| 925.0 | 0.013 |
| 924.0 | 0.013 |
| 923.0 | 0.014 |
| 922.0 | 0.013 |
| 921.0 | 0.01 |
| 920.0 | 0.014 |
| 919.0 | 0.014 |
| 918.0 | 0.013 |
| 917.0 | 0.014 |
| 916.0 | 0.013 |
| 915.0 | 0.013 |
| 914.0 | 0.015 |
| 913.0 | 0.013 |
| 912.0 | 0.014 |
| 911.0 | 0.009 |
| 910.0 | 0.013 |
| 909.0 | 0.014 |
| 908.0 | 0.016 |
| 907.0 | 0.011 |
| 906.0 | 0.012 |
| 905.0 | 0.014 |
| 904.0 | 0.013 |
| 903.0 | 0.014 |
| 902.0 | 0.015 |
| 901.0 | 0.014 |
| 900.0 | 0.012 |
| 899.0 | 0.013 |
| 898.0 | 0.015 |
| 897.0 | 0.012 |
| 896.0 | 0.016 |
| 895.0 | 0.013 |
| 894.0 | 0.016 |
| 893.0 | 0.014 |
| 892.0 | 0.015 |
| 891.0 | 0.015 |
| 890.0 | 0.015 |
| 889.0 | 0.013 |
| 888.0 | 0.012 |
| 887.0 | 0.015 |
| 886.0 | 0.012 |
| 885.0 | 0.015 |
| 884.0 | 0.014 |
| 883.0 | 0.014 |
| 882.0 | 0.012 |
| 881.0 | 0.014 |
| 880.0 | 0.017 |
| 879.0 | 0.012 |
| 878.0 | 0.014 |
| 877.0 | 0.013 |
| 876.0 | 0.015 |
| 875.0 | 0.013 |
| 874.0 | 0.013 |
| 873.0 | 0.012 |
| 872.0 | 0.013 |
| 871.0 | 0.014 |
| 870.0 | 0.012 |
| 869.0 | 0.016 |
| 868.0 | 0.015 |
| 867.0 | 0.014 |
| 866.0 | 0.015 |
| 865.0 | 0.011 |
| 864.0 | 0.014 |
| 863.0 | 0.014 |
| 862.0 | 0.014 |
| 861.0 | 0.012 |
| 860.0 | 0.012 |
| 859.0 | 0.013 |
| 858.0 | 0.014 |
| 857.0 | 0.014 |
| 856.0 | 0.013 |
| 855.0 | 0.013 |
| 854.0 | 0.013 |
| 853.0 | 0.015 |
| 852.0 | 0.016 |
| 851.0 | 0.012 |
| 850.0 | 0.014 |
| 849.0 | 0.012 |
| 848.0 | 0.012 |
| 847.0 | 0.016 |
| 846.0 | 0.015 |
| 845.0 | 0.014 |
| 844.0 | 0.014 |
| 843.0 | 0.012 |
| 842.0 | 0.013 |
| 841.0 | 0.012 |
| 840.0 | 0.013 |
| 839.0 | 0.014 |
| 838.0 | 0.016 |
| 837.0 | 0.013 |
| 836.0 | 0.015 |
| 835.0 | 0.015 |
| 834.0 | 0.014 |
| 833.0 | 0.014 |
| 832.0 | 0.014 |
| 831.0 | 0.012 |
| 830.0 | 0.016 |
| 829.0 | 0.013 |
| 828.0 | 0.011 |
| 827.0 | 0.014 |
| 826.0 | 0.014 |
| 825.0 | 0.016 |
| 824.0 | 0.014 |
| 823.0 | 0.011 |
| 822.0 | 0.016 |
| 821.0 | 0.013 |
| 820.0 | 0.013 |
| 819.0 | 0.014 |
| 818.0 | 0.015 |
| 817.0 | 0.013 |
| 816.0 | 0.015 |
| 815.0 | 0.013 |
| 814.0 | 0.015 |
| 813.0 | 0.013 |
| 812.0 | 0.014 |
| 811.0 | 0.016 |
| 810.0 | 0.015 |
| 809.0 | 0.012 |
| 808.0 | 0.015 |
| 807.0 | 0.014 |
| 806.0 | 0.014 |
| 805.0 | 0.014 |
| 804.0 | 0.013 |
| 803.0 | 0.013 |
| 802.0 | 0.015 |
| 801.0 | 0.013 |
| 800.0 | 0.014 |
| 799.0 | 0.001 |
| 798.0 | 0.001 |
| 797.0 | 0.001 |
| 796.0 | 0.001 |
| 795.0 | 0.001 |
| 794.0 | 0.001 |
| 793.0 | 0.001 |
| 792.0 | 0.001 |
| 791.0 | 0.001 |
| 790.0 | 0.001 |
| 789.0 | 0.002 |
| 788.0 | 0.001 |
| 787.0 | 0.002 |
| 786.0 | 0.002 |
| 785.0 | 0.002 |
| 784.0 | 0.002 |
| 783.0 | 0.002 |
| 782.0 | 0.002 |
| 781.0 | 0.002 |
| 780.0 | 0.002 |
| 779.0 | 0.002 |
| 778.0 | 0.002 |
| 777.0 | 0.002 |
| 776.0 | 0.002 |
| 775.0 | 0.002 |
| 774.0 | 0.002 |
| 773.0 | 0.002 |
| 772.0 | 0.002 |
| 771.0 | 0.002 |
| 770.0 | 0.003 |
| 769.0 | 0.003 |
| 768.0 | 0.003 |
| 767.0 | 0.004 |
| 766.0 | 0.005 |
| 765.0 | 0.005 |
| 764.0 | 0.006 |
| 763.0 | 0.005 |
| 762.0 | 0.004 |
| 761.0 | 0.003 |
| 760.0 | 0.002 |
| 759.0 | 0.001 |
| 758.0 | 0.001 |
| 757.0 | 0 |
| 756.0 | 0 |
| 755.0 | 0 |
| 754.0 | 0 |
| 753.0 | 0 |
| 752.0 | 0 |
| 751.0 | 0 |
| 750.0 | 0 |
| 749.0 | 0 |
| 748.0 | 0 |
| 747.0 | 0 |
| 746.0 | 0 |
| 745.0 | 0 |
| 744.0 | 0 |
| 743.0 | 0 |
| 742.0 | 0 |
| 741.0 | 0 |
| 740.0 | 0 |
| 739.0 | 0 |
| 738.0 | 0 |
| 737.0 | 0 |
| 736.0 | 0 |
| 735.0 | 0 |
| 734.0 | 0 |
| 733.0 | 0 |
| 732.0 | 0 |
| 731.0 | 0 |
| 730.0 | 0 |
| 729.0 | 0 |
| 728.0 | 0 |
| 727.0 | 0 |
| 726.0 | 0 |
| 725.0 | 0 |
| 724.0 | 0 |
| 723.0 | 0 |
| 722.0 | 0 |
| 721.0 | 0 |
| 720.0 | 0 |
| 719.0 | 0 |
| 718.0 | 0 |
| 717.0 | 0 |
| 716.0 | 0 |
| 715.0 | 0 |
| 714.0 | 0 |
| 713.0 | 0 |
| 712.0 | 0 |
| 711.0 | 0 |
| 710.0 | 0 |
| 709.0 | 0 |
| 708.0 | 0 |
| 707.0 | 0 |
| 706.0 | 0 |
| 705.0 | 0 |
| 704.0 | 0 |
| 703.0 | 0 |
| 702.0 | 0 |
| 701.0 | 0 |
| 700.0 | 0 |
| 699.0 | 0 |
| 698.0 | 0 |
| 697.0 | 0 |
| 696.0 | 0 |
| 695.0 | 0 |
| 694.0 | 0 |
| 693.0 | 0 |
| 692.0 | 0 |
| 691.0 | 0 |
| 690.0 | 0 |
| 689.0 | 0 |
| 688.0 | 0 |
| 687.0 | 0 |
| 686.0 | 0 |
| 685.0 | 0 |
| 684.0 | 0 |
| 683.0 | 0 |
| 682.0 | 0 |
| 681.0 | 0 |
| 680.0 | 0 |
| 679.0 | 0 |
| 678.0 | 0 |
| 677.0 | 0 |
| 676.0 | 0 |
| 675.0 | 0 |
| 674.0 | 0 |
| 673.0 | 0 |
| 672.0 | 0 |
| 671.0 | 0 |
| 670.0 | 0 |
| 669.0 | 0 |
| 668.0 | 0 |
| 667.0 | 0 |
| 666.0 | 0 |
| 665.0 | 0 |
| 664.0 | 0 |
| 663.0 | 0 |
| 662.0 | 0 |
| 661.0 | 0 |
| 660.0 | 0 |
| 659.0 | 0 |
| 658.0 | 0 |
| 657.0 | 0 |
| 656.0 | 0 |
| 655.0 | 0 |
| 654.0 | 0 |
| 653.0 | 0 |
| 652.0 | 0 |
| 651.0 | 0 |
| 650.0 | 0 |
| 649.0 | 0 |
| 648.0 | 0 |
| 647.0 | 0 |
| 646.0 | 0 |
| 645.0 | 0 |
| 644.0 | 0 |
| 643.0 | 0 |
| 642.0 | 0 |
| 641.0 | 0 |
| 640.0 | 0 |
| 639.0 | 0 |
| 638.0 | 0 |
| 637.0 | 0 |
| 636.0 | 0 |
| 635.0 | 0 |
| 634.0 | 0 |
| 633.0 | 0 |
| 632.0 | 0 |
| 631.0 | 0 |
| 630.0 | 0 |
| 629.0 | 0 |
| 628.0 | 0 |
| 627.0 | 0 |
| 626.0 | 0 |
| 625.0 | 0 |
| 624.0 | 0 |
| 623.0 | 0 |
| 622.0 | 0 |
| 621.0 | 0 |
| 620.0 | 0 |
| 619.0 | 0 |
| 618.0 | 0 |
| 617.0 | 0 |
| 616.0 | 0 |
| 615.0 | 0 |
| 614.0 | 0 |
| 613.0 | 0 |
| 612.0 | 0 |
| 611.0 | 0 |
| 610.0 | 0 |
| 609.0 | 0 |
| 608.0 | 0 |
| 607.0 | 0 |
| 606.0 | 0 |
| 605.0 | 0 |
| 604.0 | 0 |
| 603.0 | 0 |
| 602.0 | 0 |
| 601.0 | 0 |
| 600.0 | 0 |
| 599.0 | 0 |
| 598.0 | 0 |
| 597.0 | 0 |
| 596.0 | 0 |
| 595.0 | 0 |
| 594.0 | 0 |
| 593.0 | 0 |
| 592.0 | 0 |
| 591.0 | 0 |
| 590.0 | 0 |
| 589.0 | 0 |
| 588.0 | 0 |
| 587.0 | 0 |
| 586.0 | 0 |
| 585.0 | 0 |
| 584.0 | 0 |
| 583.0 | 0 |
| 582.0 | 0 |
| 581.0 | 0 |
| 580.0 | 0 |
| 579.0 | 0 |
| 578.0 | 0 |
| 577.0 | 0 |
| 576.0 | 0 |
| 575.0 | 0 |
| 574.0 | 0 |
| 573.0 | 0 |
| 572.0 | 0 |
| 571.0 | 0 |
| 570.0 | 0 |
| 569.0 | 0 |
| 568.0 | 0 |
| 567.0 | 0 |
| 566.0 | 0 |
| 565.0 | 0 |
| 564.0 | 0 |
| 563.0 | 0 |
| 562.0 | 0 |
| 561.0 | 0 |
| 560.0 | 0 |
| 559.0 | 0 |
| 558.0 | 0 |
| 557.0 | 0 |
| 556.0 | 0 |
| 555.0 | 0 |
| 554.0 | 0 |
| 553.0 | 0 |
| 552.0 | 0 |
| 551.0 | 0 |
| 550.0 | 0 |
| 549.0 | 0 |
| 548.0 | 0 |
| 547.0 | 0 |
| 546.0 | 0 |
| 545.0 | 0 |
| 544.0 | 0 |
| 543.0 | 0.001 |
| 542.0 | 0.001 |
| 541.0 | 0.001 |
| 540.0 | 0.002 |
| 539.0 | 0.004 |
| 538.0 | 0.007 |
| 537.0 | 0.017 |
| 536.0 | 0.054 |
| 535.0 | 0.311 |
| 534.0 | 4.881 |
| 533.0 | 19.984 |
| 532.0 | 29.412 |
| 531.0 | 17.255 |
| 530.0 | 3.313 |
| 529.0 | 0.188 |
| 528.0 | 0.036 |
| 527.0 | 0.011 |
| 526.0 | 0.005 |
| 525.0 | 0.002 |
| 524.0 | 0.001 |
| 523.0 | 0.001 |
| 522.0 | 0.001 |
| 521.0 | 0 |
| 520.0 | 0 |
| 519.0 | 0 |
| 518.0 | 0 |
| 517.0 | 0 |
| 516.0 | 0 |
| 515.0 | 0 |
| 514.0 | 0 |
| 513.0 | 0 |
| 512.0 | 0 |
| 511.0 | 0 |
| 510.0 | 0 |
| 509.0 | 0 |
| 508.0 | 0 |
| 507.0 | 0 |
| 506.0 | 0 |
| 505.0 | 0 |
| 504.0 | 0 |
| 503.0 | 0 |
| 502.0 | 0 |
| 501.0 | 0 |
| 500.0 | 0 |
| 499.0 | 0 |
| 498.0 | 0 |
| 497.0 | 0 |
| 496.0 | 0 |
| 495.0 | 0 |
| 494.0 | 0 |
| 493.0 | 0 |
| 492.0 | 0 |
| 491.0 | 0 |
| 490.0 | 0 |
| 489.0 | 0 |
| 488.0 | 0 |
| 487.0 | 0 |
| 486.0 | 0 |
| 485.0 | 0 |
| 484.0 | 0 |
| 483.0 | 0 |
| 482.0 | 0 |
| 481.0 | 0 |
| 480.0 | 0 |
| 479.0 | 0 |
| 478.0 | 0 |
| 477.0 | 0 |
| 476.0 | 0 |
| 475.0 | 0 |
| 474.0 | 0 |
| 473.0 | 0 |
| 472.0 | 0 |
| 471.0 | 0 |
| 470.0 | 0 |
| 469.0 | 0 |
| 468.0 | 0 |
| 467.0 | 0 |
| 466.0 | 0 |
| 465.0 | 0 |
| 464.0 | 0 |
| 463.0 | 0 |
| 462.0 | 0 |
| 461.0 | 0 |
| 460.0 | 0 |
| 459.0 | 0 |
| 458.0 | 0 |
| 457.0 | 0 |
| 456.0 | 0 |
| 455.0 | 0 |
| 454.0 | 0 |
| 453.0 | 0 |
| 452.0 | 0 |
| 451.0 | 0 |
| 450.0 | 0 |
| 449.0 | 0 |
| 448.0 | 0 |
| 447.0 | 0 |
| 446.0 | 0 |
| 445.0 | 0 |
| 444.0 | 0 |
| 443.0 | 0 |
| 442.0 | 0 |
| 441.0 | 0 |
| 440.0 | 0 |
| 439.0 | 0 |
| 438.0 | 0 |
| 437.0 | 0 |
| 436.0 | 0 |
| 435.0 | 0 |
| 434.0 | 0 |
| 433.0 | 0 |
| 432.0 | 0.001 |
| 431.0 | 0.001 |
| 430.0 | 0.003 |
| 429.0 | 0.004 |
| 428.0 | 0.007 |
| 427.0 | 0.008 |
| 426.0 | 0.007 |
| 425.0 | 0.005 |
| 424.0 | 0.004 |
| 423.0 | 0.004 |
| 422.0 | 0.004 |
| 421.0 | 0.004 |
| 420.0 | 0.004 |
| 419.0 | 0.004 |
| 418.0 | 0.004 |
| 417.0 | 0.004 |
| 416.0 | 0.004 |
| 415.0 | 0.003 |
| 414.0 | 0.003 |
| 413.0 | 0.004 |
| 412.0 | 0.004 |
| 411.0 | 0.005 |
| 410.0 | 0.006 |
| 409.0 | 0.007 |
| 408.0 | 0.009 |
| 407.0 | 0.009 |
| 406.0 | 0.008 |
| 405.0 | 0.008 |
| 404.0 | 0.008 |
| 403.0 | 0.007 |
| 402.0 | 0.008 |
| 401.0 | 0.008 |
| 400.0 | 0.007 |
| 399.0 | 0.006 |
| 398.0 | 0.005 |
| 397.0 | 0.005 |
| 396.0 | 0.004 |
| 395.0 | 0.004 |
| 394.0 | 0.004 |
| 393.0 | 0.004 |
| 392.0 | 0.004 |
| 391.0 | 0.004 |
| 390.0 | 0.003 |
| 389.0 | 0.002 |
| 388.0 | 0.002 |
| 387.0 | 0.001 |
| 386.0 | 0.001 |
| 385.0 | 0.001 |
| 384.0 | 0.001 |
| 383.0 | 0 |
| 382.0 | 0 |
| 381.0 | 0 |
| 380.0 | 0 |
| 379.0 | 0 |
| 378.0 | 0.001 |
| 377.0 | 0 |
| 376.0 | 0.001 |
| 375.0 | 0.001 |
| 374.0 | 0.001 |
| 373.0 | 0.001 |
| 372.0 | 0.001 |
| 371.0 | 0.001 |
| 370.0 | 0.001 |
| 369.0 | 0.001 |
| 368.0 | 0 |
| 367.0 | 0 |
| 366.0 | 0 |
| 365.0 | 0 |
| 364.0 | 0 |
| 363.0 | 0 |
| 362.0 | 0 |
| 361.0 | 0 |
| 360.0 | 0 |
| 359.0 | 0 |
| 358.0 | 0 |
| 357.0 | 0 |
| 356.0 | 0 |
| 355.0 | 0 |
| 354.0 | 0 |
| 353.0 | 0 |
| 352.0 | 0 |
| 351.0 | 0 |
| 350.0 | 0 |
| 349.0 | 0.001 |
| 348.0 | 0 |
| 347.0 | 0 |
| 346.0 | 0 |
| 345.0 | 0 |
| 344.0 | 0 |
| 343.0 | 0 |
| 342.0 | 0 |
| 341.0 | 0 |
| 340.0 | 0 |
| 339.0 | 0 |
| 338.0 | 0 |
| 337.0 | 0 |
| 336.0 | 0 |
| 335.0 | 0 |
| 334.0 | 0 |
| 333.0 | 0 |
| 332.0 | 0 |
| 331.0 | 0 |
| 330.0 | 0 |
| 329.0 | 0 |
| 328.0 | 0 |
| 327.0 | 0 |
| 326.0 | 0 |
| 325.0 | 0 |
| 324.0 | 0 |
| 323.0 | 0 |
| 322.0 | 0 |
| 321.0 | 0 |
| 320.0 | 0 |
| 319.0 | 0 |
| 318.0 | 0 |
| 317.0 | 0 |
| 316.0 | 0 |
| 315.0 | 0 |
| 314.0 | 0 |
| 313.0 | 0 |
| 312.0 | 0 |
| 311.0 | 0 |
| 310.0 | 0 |
| 309.0 | 0 |
| 308.0 | 0 |
| 307.0 | 0 |
| 306.0 | 0 |
| 305.0 | 0 |
| 304.0 | 0 |
| 303.0 | 0 |
| 302.0 | 0 |
| 301.0 | 0 |
| 300.0 | 0 |
| 299.0 | 0 |
| 298.0 | 0 |
| 297.0 | 0 |
| 296.0 | 0 |
| 295.0 | 0 |
| 294.0 | 0 |
| 293.0 | 0 |
| 292.0 | 0 |
| 291.0 | 0 |
| 290.0 | 0 |
| 289.0 | 0 |
| 288.0 | 0 |
| 287.0 | 0 |
| 286.0 | 0 |
| 285.0 | 0 |
| 284.0 | 0 |
| 283.0 | 0 |
| 282.0 | 0 |
| 281.0 | 0 |
| 280.0 | 0 |
| 279.0 | 0 |
| 278.0 | 0 |
| 277.0 | 0 |
| 276.0 | 0 |
| 275.0 | 0 |
| 274.0 | 0 |
| 273.0 | 0 |
| 272.0 | 0 |
| 271.0 | 0 |
| 270.0 | 0 |
| 269.0 | 0 |
| 268.0 | 0 |
| 267.0 | 0 |
| 266.0 | 0 |
| 265.0 | 0 |
| 264.0 | 0 |
| 263.0 | 0 |
| 262.0 | 0 |
| 261.0 | 0 |
| 260.0 | 0 |
| 259.0 | 0 |
| 258.0 | 0 |
| 257.0 | 0 |
| 256.0 | 0 |
| 255.0 | 0 |
| 254.0 | 0 |
| 253.0 | 0 |
| 252.0 | 0 |
| 251.0 | 0 |
| 250.0 | 0 |
| 249.0 | 0 |
| 248.0 | 0 |
| 247.0 | 0 |
| 246.0 | 0 |
| 245.0 | 0 |
| 244.0 | 0 |
| 243.0 | 0 |
| 242.0 | 0 |
| 241.0 | 0 |
| 240.0 | 0 |
| 239.0 | 0 |
| 238.0 | 0 |
| 237.0 | 0 |
| 236.0 | 0 |
| 235.0 | 0 |
| 234.0 | 0 |
| 233.0 | 0 |
| 232.0 | 0 |
| 231.0 | 0 |
| 230.0 | 0 |
| 229.0 | 0 |
| 228.0 | 0 |
| 227.0 | 0 |
| 226.0 | 0 |
| 225.0 | 0 |
| 224.0 | 0 |
| 223.0 | 0 |
| 222.0 | 0 |
| 221.0 | 0 |
| 220.0 | 0 |
| 219.0 | 0 |
| 218.0 | 0 |
| 217.0 | 0 |
| 216.0 | 0 |
| 215.0 | 0 |
| 214.0 | 0 |
| 213.0 | 0 |
| 212.0 | 0 |
| 211.0 | 0 |
| 210.0 | 0 |
| 209.0 | 0 |
| 208.0 | 0 |
| 207.0 | 0 |
| 206.0 | 0 |
| 205.0 | 0 |
| 204.0 | 0 |
| 203.0 | 0 |
| 202.0 | 0.001 |
| 201.0 | 0 |
| 200.0 | 0.001 |